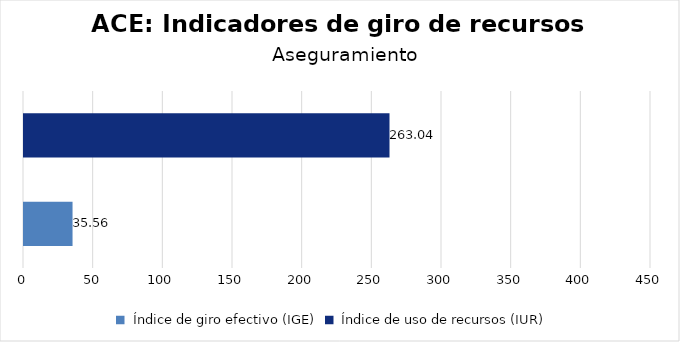
| Category | Series 0 |
|---|---|
| Índice de giro efectivo (IGE) | 35.556 |
| Índice de uso de recursos (IUR)  | 263.043 |